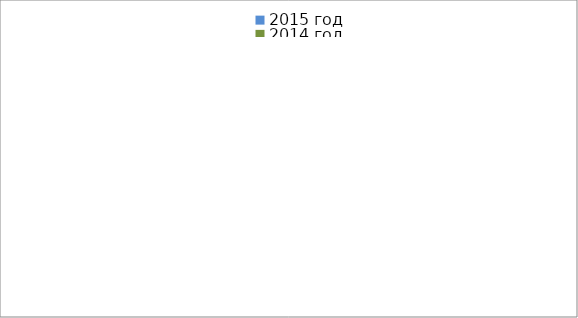
| Category | 2015 год | 2014 год |
|---|---|---|
|  - поджог | 14 | 11 |
|  - неосторожное обращение с огнём | 42 | 24 |
|  - НПТЭ электрооборудования | 7 | 14 |
|  - НПУ и Э печей | 39 | 45 |
|  - НПУ и Э транспортных средств | 35 | 44 |
|   -Шалость с огнем детей | 3 | 0 |
|  -НППБ при эксплуатации эл.приборов | 10 | 16 |
|  - курение | 17 | 17 |
| - прочие | 47 | 67 |
| - не установленные причины | 6 | 7 |